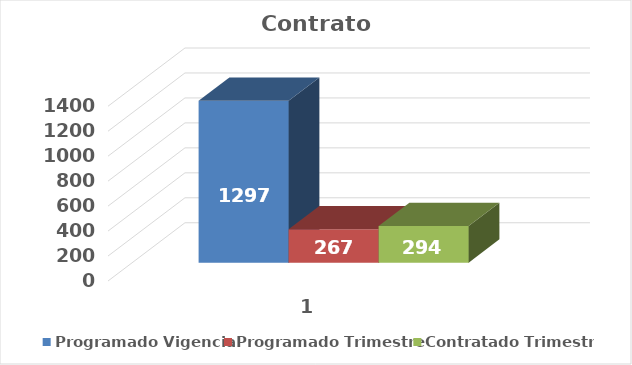
| Category | Programado Vigencia | Programado Trimestre | Contratado Trimestre |
|---|---|---|---|
| 0 | 1297 | 267 | 294 |